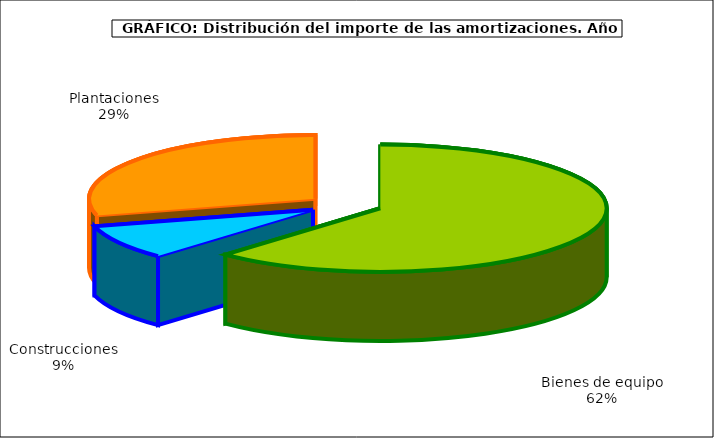
| Category | Series 0 |
|---|---|
| Bienes de equipo | 3467.333 |
| Construcciones | 491.497 |
| Plantaciones | 1633.694 |